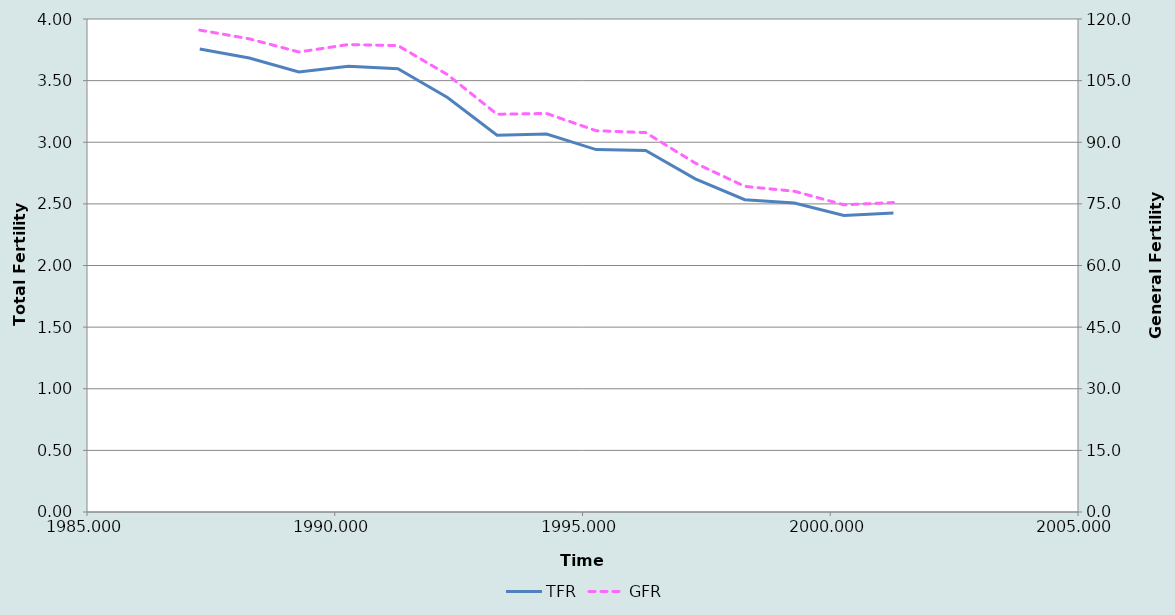
| Category | TFR |
|---|---|
| 1987.2753424657535 | 3.756 |
| 1988.2753424657535 | 3.683 |
| 1989.2753424657535 | 3.57 |
| 1990.2753424657535 | 3.617 |
| 1991.2753424657535 | 3.597 |
| 1992.2753424657535 | 3.363 |
| 1993.2753424657535 | 3.057 |
| 1994.2753424657535 | 3.066 |
| 1995.2753424657535 | 2.94 |
| 1996.2753424657535 | 2.933 |
| 1997.2753424657535 | 2.703 |
| 1998.2753424657535 | 2.534 |
| 1999.2753424657535 | 2.506 |
| 2000.2753424657535 | 2.406 |
| 2001.2753424657535 | 2.426 |